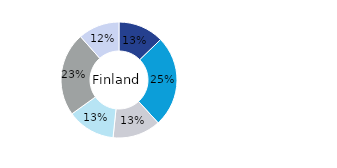
| Category | Finland |
|---|---|
| Office | 0.127 |
| Residential | 0.255 |
| Retail | 0.134 |
| Logistics* | 0.134 |
| Public Sector | 0.234 |
| Other | 0.115 |